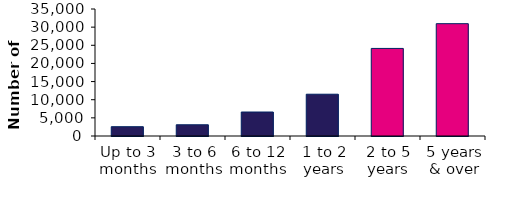
| Category | Series 1 |
|---|---|
| Up to 3 months | 2565 |
| 3 to 6 months | 3094 |
| 6 to 12 months | 6607 |
| 1 to 2 years | 11512 |
| 2 to 5 years | 24134 |
| 5 years & over | 30954 |